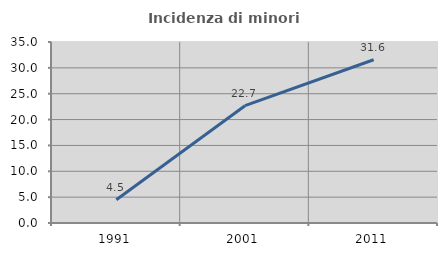
| Category | Incidenza di minori stranieri |
|---|---|
| 1991.0 | 4.494 |
| 2001.0 | 22.68 |
| 2011.0 | 31.567 |